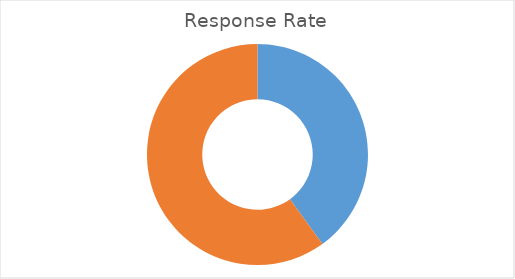
| Category | Total |
|---|---|
| Sum of Overall Resp | 40 |
| Sum of Overall Non Response Rate | 60 |